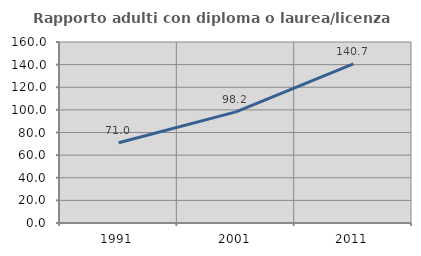
| Category | Rapporto adulti con diploma o laurea/licenza media  |
|---|---|
| 1991.0 | 70.996 |
| 2001.0 | 98.233 |
| 2011.0 | 140.741 |